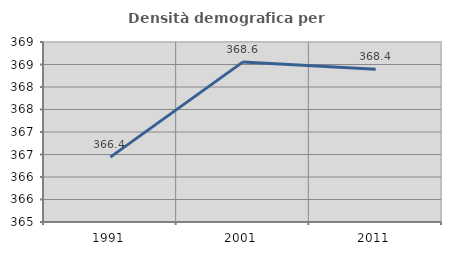
| Category | Densità demografica |
|---|---|
| 1991.0 | 366.441 |
| 2001.0 | 368.558 |
| 2011.0 | 368.392 |